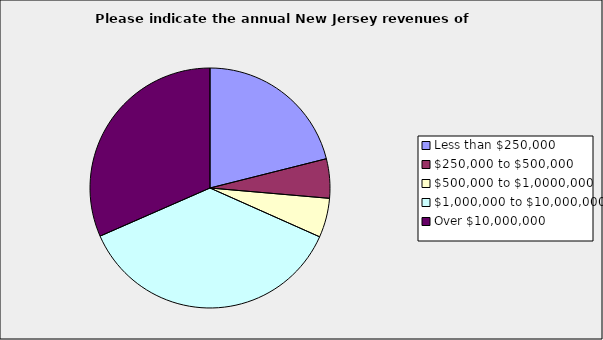
| Category | Series 0 |
|---|---|
| Less than $250,000 | 0.211 |
| $250,000 to $500,000 | 0.053 |
| $500,000 to $1,0000,000 | 0.053 |
| $1,000,000 to $10,000,000 | 0.368 |
| Over $10,000,000 | 0.316 |